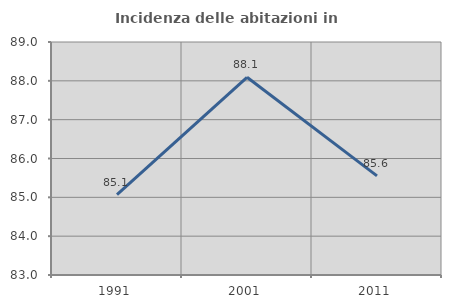
| Category | Incidenza delle abitazioni in proprietà  |
|---|---|
| 1991.0 | 85.069 |
| 2001.0 | 88.091 |
| 2011.0 | 85.553 |